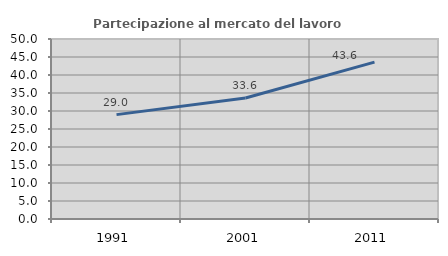
| Category | Partecipazione al mercato del lavoro  femminile |
|---|---|
| 1991.0 | 28.992 |
| 2001.0 | 33.594 |
| 2011.0 | 43.568 |